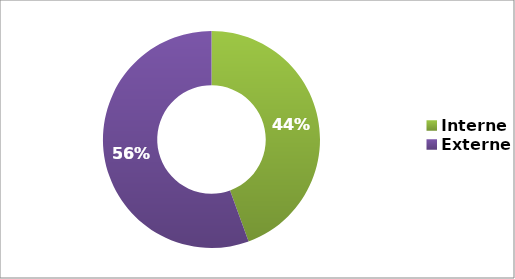
| Category | Series 0 |
|---|---|
| Interne | 0.444 |
| Externe | 0.556 |